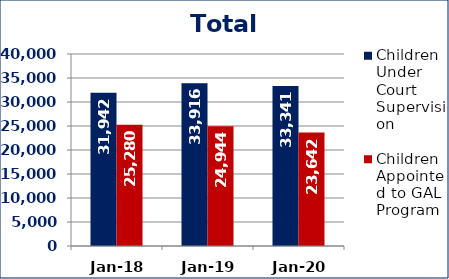
| Category | Children Under Court Supervision  | Children Appointed to GAL Program  |
|---|---|---|
| Jan-18 | 31942 | 25280 |
| Jan-19 | 33916 | 24944 |
| Jan-20 | 33341 | 23642 |